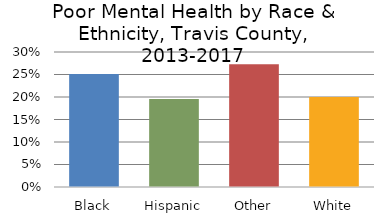
| Category | Series 0 |
|---|---|
| Black | 0.251 |
| Hispanic | 0.196 |
| Other | 0.273 |
| White | 0.2 |